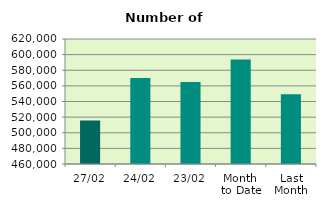
| Category | Series 0 |
|---|---|
| 27/02 | 515586 |
| 24/02 | 570062 |
| 23/02 | 564882 |
| Month 
to Date | 593624.105 |
| Last
Month | 549126.273 |